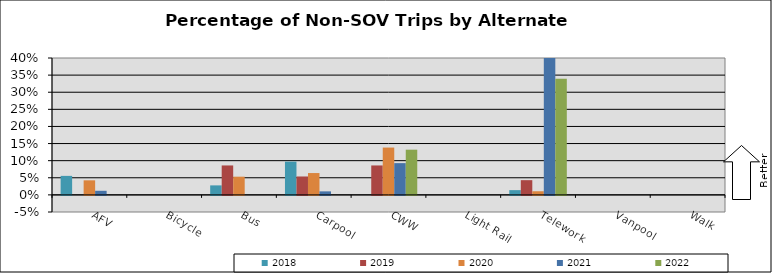
| Category | 2018 | 2019 | 2020 | 2021 | 2022 |
|---|---|---|---|---|---|
| AFV | 0.056 | 0 | 0.043 | 0.012 | 0 |
| Bicycle | 0 | 0 | 0 | 0 | 0 |
| Bus | 0.028 | 0.086 | 0.053 | 0 | 0 |
| Carpool | 0.097 | 0.054 | 0.064 | 0.01 | 0 |
| CWW | 0 | 0.086 | 0.138 | 0.093 | 0.132 |
| Light Rail | 0 | 0 | 0 | 0 | 0 |
| Telework | 0.014 | 0.043 | 0.011 | 0.536 | 0.34 |
| Vanpool | 0 | 0 | 0 | 0 | 0 |
| Walk | 0 | 0 | 0 | 0 | 0 |